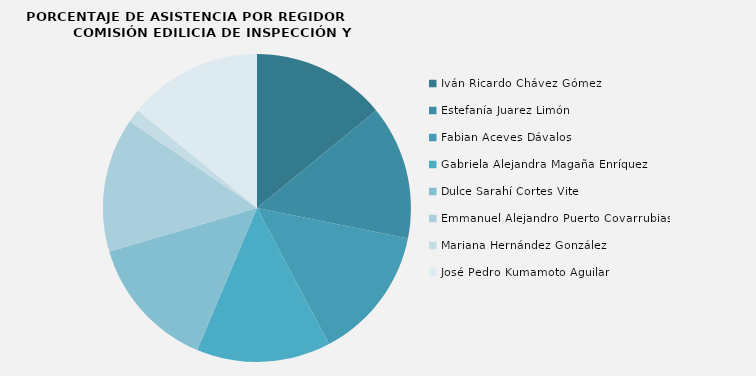
| Category | Iván Ricardo Chávez Gómez  |
|---|---|
| Iván Ricardo Chávez Gómez  | 100 |
| Estefanía Juarez Limón | 100 |
| Fabian Aceves Dávalos | 100 |
| Gabriela Alejandra Magaña Enríquez | 100 |
| Dulce Sarahí Cortes Vite | 100 |
| Emmanuel Alejandro Puerto Covarrubias | 100 |
| Mariana Hernández González | 10 |
| José Pedro Kumamoto Aguilar | 100 |